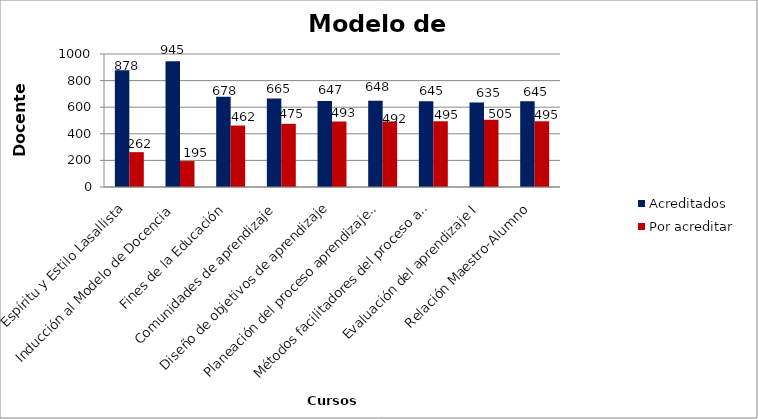
| Category | Acreditados | Por acreditar |
|---|---|---|
| Espíritu y Estilo Lasallista | 878 | 262 |
| Inducción al Modelo de Docencia | 945 | 195 |
| Fines de la Educación | 678 | 462 |
| Comunidades de aprendizaje | 665 | 475 |
| Diseño de objetivos de aprendizaje | 647 | 493 |
| Planeación del proceso aprendizaje-enseñanza I | 648 | 492 |
| Métodos facilitadores del proceso aprendizaje - enseñanza I | 645 | 495 |
| Evaluación del aprendizaje I | 635 | 505 |
| Relación Maestro-Alumno | 645 | 495 |